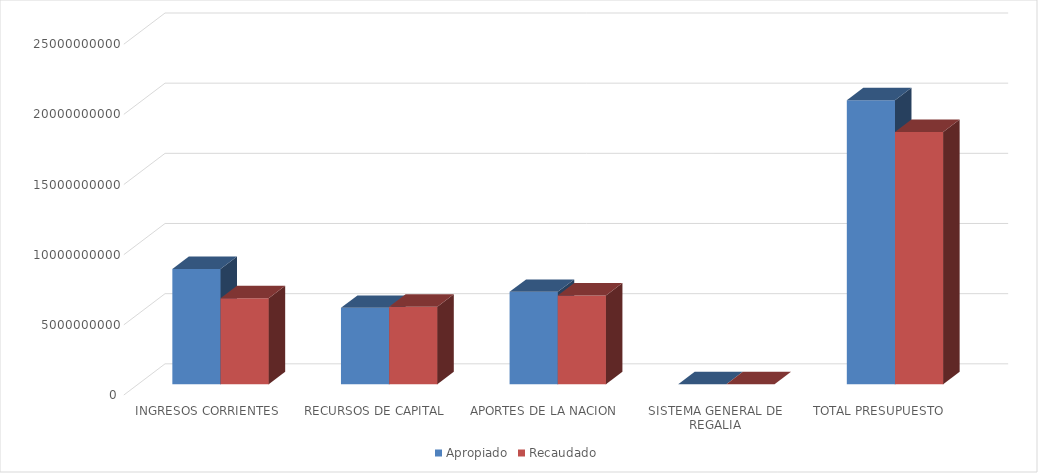
| Category | Apropiado | Recaudado |
|---|---|---|
| INGRESOS CORRIENTES | 8207550000 | 6124196203.78 |
| RECURSOS DE CAPITAL | 5441833209 | 5528965409.66 |
| APORTES DE LA NACION | 6581710301 | 6316895126 |
| SISTEMA GENERAL DE REGALIA | 0 | 0 |
| TOTAL PRESUPUESTO  | 20231093510 | 17970056739.44 |